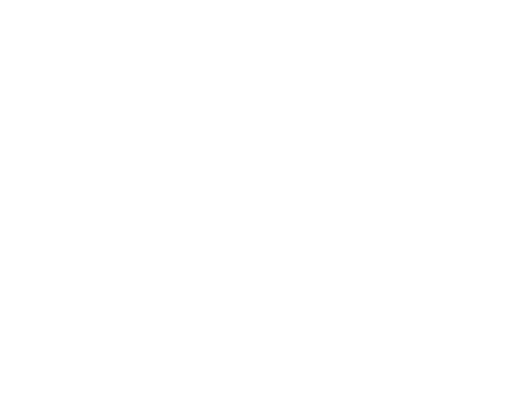
| Category | Series 0 | Series 1 | Series 2 |
|---|---|---|---|
| Impuestos | 63170000 | 0.148 |  |
| Cuotas y Aportaciones de Seguridad Social | 0 | 0 |  |
| Contribuciones de Mejoras | 2200000 | 0.005 |  |
| Derechos | 59285000 | 0.139 |  |
| Productos | 800000 | 0.002 |  |
| Aprovechamientos | 7650000 | 0.018 |  |
| Ingresos por Ventas de Bienes y Servicios | 0 | 0 |  |
| Participaciones y Aportaciones | 266000000 | 0.623 |  |
| Transferencias, Asignaciones, Subsidios y Otras Ayudas | 28000000 | 0.066 |  |
| Ingresos Derivados de Financiamientos | 0 | 0 |  |